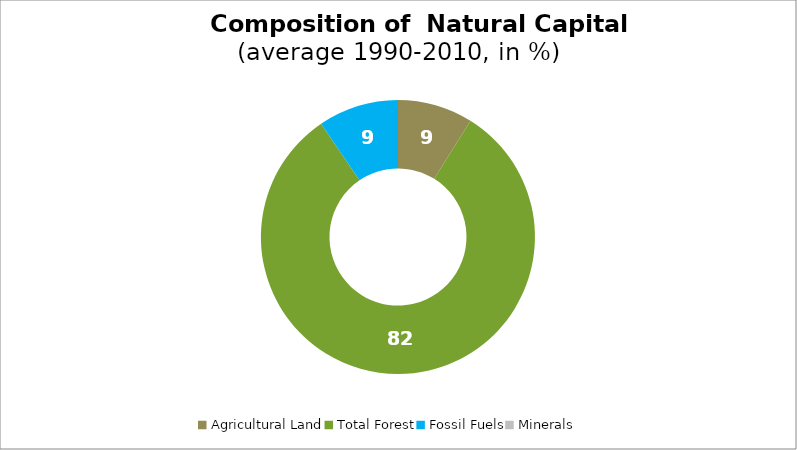
| Category | Series 0 |
|---|---|
| Agricultural Land | 8.869 |
| Total Forest | 81.643 |
| Fossil Fuels | 9.488 |
| Minerals | 0 |